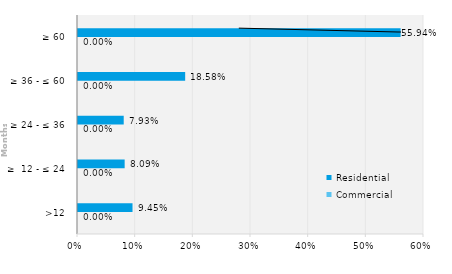
| Category | Commercial | Residential |
|---|---|---|
| >12 | 0 | 0.095 |
| ≥  12 - ≤ 24 | 0 | 0.081 |
| ≥ 24 - ≤ 36 | 0 | 0.079 |
| ≥ 36 - ≤ 60 | 0 | 0.186 |
| ≥ 60 | 0 | 0.559 |